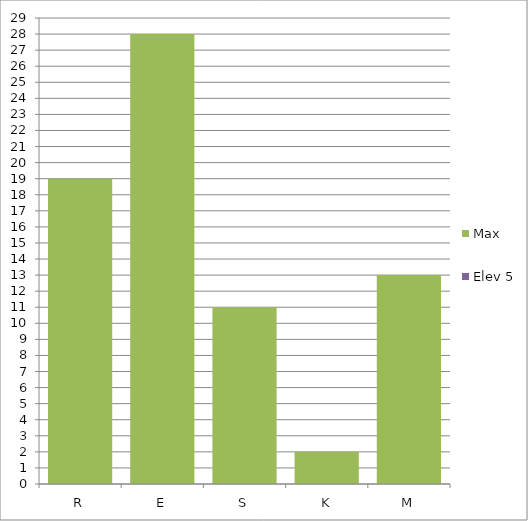
| Category | Max | Elev 5 |
|---|---|---|
| R | 19 | 0 |
| E | 28 | 0 |
| S | 11 | 0 |
| K | 2 | 0 |
| M | 13 | 0 |